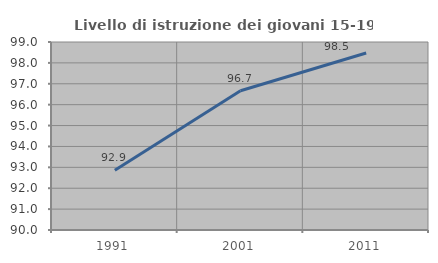
| Category | Livello di istruzione dei giovani 15-19 anni |
|---|---|
| 1991.0 | 92.857 |
| 2001.0 | 96.667 |
| 2011.0 | 98.473 |